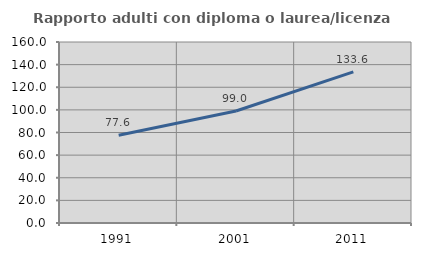
| Category | Rapporto adulti con diploma o laurea/licenza media  |
|---|---|
| 1991.0 | 77.605 |
| 2001.0 | 99.037 |
| 2011.0 | 133.594 |